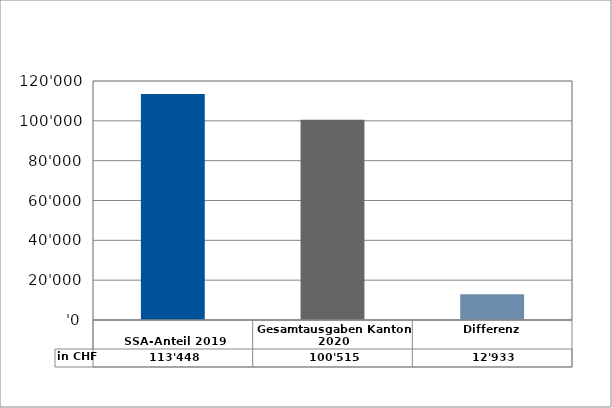
| Category | in CHF |
|---|---|
| 
SSA-Anteil 2019

 | 113447.8 |
| Gesamtausgaben Kanton 2020
 | 100515 |
| Differenz | 12932.8 |